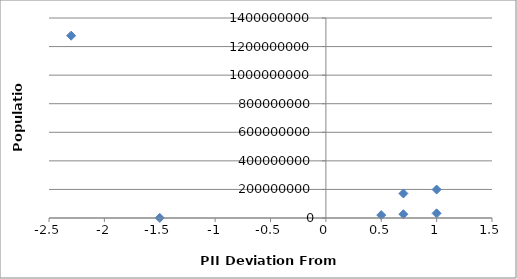
| Category | Population |
|---|---|
| -2.3 | 1276267000 |
| 1.0 | 199085847 |
| 0.7000000000000002 | 171700000 |
| 1.0 | 32564342 |
| 0.7000000000000002 | 26494504 |
| -1.5 | 742737 |
| 0.5 | 20277597 |